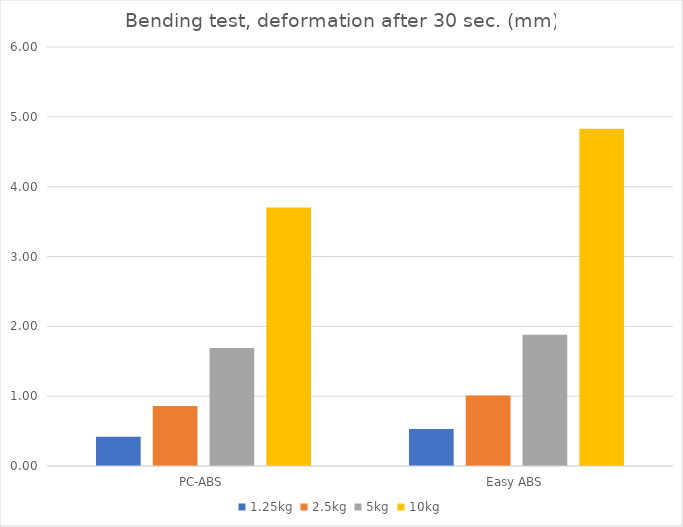
| Category | 1.25kg | 2.5kg | 5kg | 10kg |
|---|---|---|---|---|
| PC-ABS | 0.42 | 0.86 | 1.69 | 3.7 |
| Easy ABS | 0.53 | 1.01 | 1.88 | 4.83 |